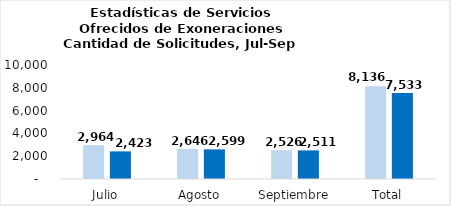
| Category | Tramitadas |
|---|---|
| Julio | 2423 |
| Agosto | 2599 |
| Septiembre | 2511 |
| Total | 7533 |